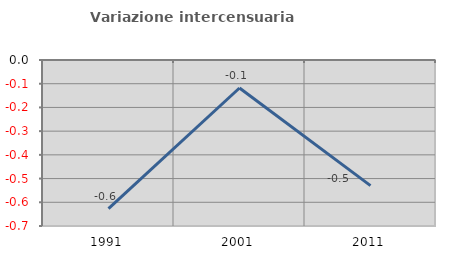
| Category | Variazione intercensuaria annua |
|---|---|
| 1991.0 | -0.627 |
| 2001.0 | -0.118 |
| 2011.0 | -0.53 |